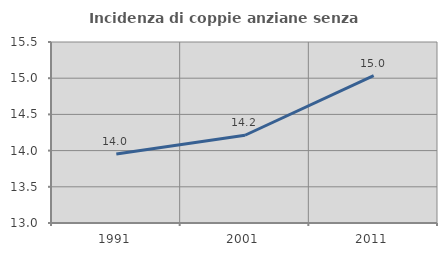
| Category | Incidenza di coppie anziane senza figli  |
|---|---|
| 1991.0 | 13.953 |
| 2001.0 | 14.212 |
| 2011.0 | 15.035 |